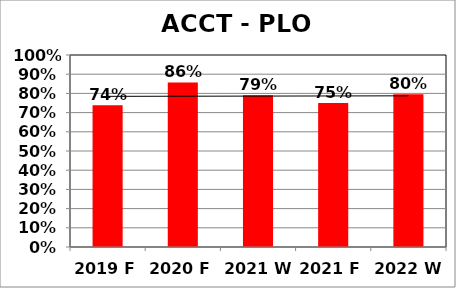
| Category | Series 0 |
|---|---|
| 2019 F | 0.738 |
| 2020 F | 0.857 |
| 2021 W | 0.79 |
| 2021 F | 0.75 |
| 2022 W | 0.795 |